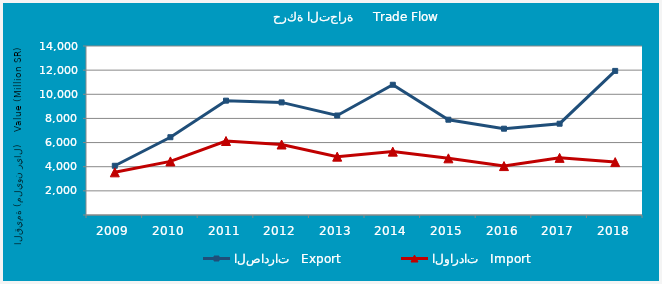
| Category | الصادرات   Export | الواردات   Import |
|---|---|---|
| 2009.0 | 4078024069 | 3534174962 |
| 2010.0 | 6444199354 | 4438735512 |
| 2011.0 | 9471038730 | 6128900177 |
| 2012.0 | 9328455169 | 5840097503 |
| 2013.0 | 8243151442 | 4833506219 |
| 2014.0 | 10788855255 | 5249590966 |
| 2015.0 | 7894132245 | 4694438323 |
| 2016.0 | 7149925037 | 4051682175 |
| 2017.0 | 7562657392 | 4733206457 |
| 2018.0 | 11937492882 | 4381625857 |